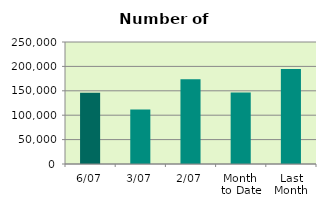
| Category | Series 0 |
|---|---|
| 6/07 | 146008 |
| 3/07 | 111444 |
| 2/07 | 173870 |
| Month 
to Date | 146286.5 |
| Last
Month | 194460.727 |